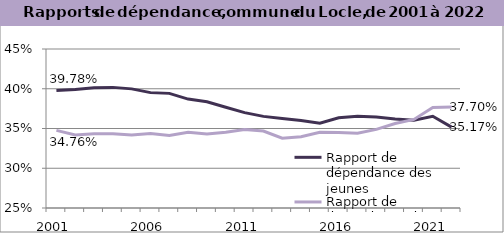
| Category | Rapport de dépendance des jeunes | Rapport de dépendance des personnes âgées |
|---|---|---|
| 2001.0 | 0.398 | 0.348 |
| 2002.0 | 0.399 | 0.342 |
| 2003.0 | 0.401 | 0.343 |
| 2004.0 | 0.402 | 0.344 |
| 2005.0 | 0.4 | 0.342 |
| 2006.0 | 0.395 | 0.344 |
| 2007.0 | 0.394 | 0.341 |
| 2008.0 | 0.387 | 0.345 |
| 2009.0 | 0.384 | 0.343 |
| 2010.0 | 0.377 | 0.345 |
| 2011.0 | 0.37 | 0.349 |
| 2012.0 | 0.365 | 0.347 |
| 2013.0 | 0.363 | 0.338 |
| 2014.0 | 0.36 | 0.34 |
| 2015.0 | 0.357 | 0.345 |
| 2016.0 | 0.363 | 0.345 |
| 2017.0 | 0.365 | 0.344 |
| 2018.0 | 0.365 | 0.349 |
| 2019.0 | 0.362 | 0.356 |
| 2020.0 | 0.36 | 0.361 |
| 2021.0 | 0.365 | 0.376 |
| 2022.0 | 0.352 | 0.377 |